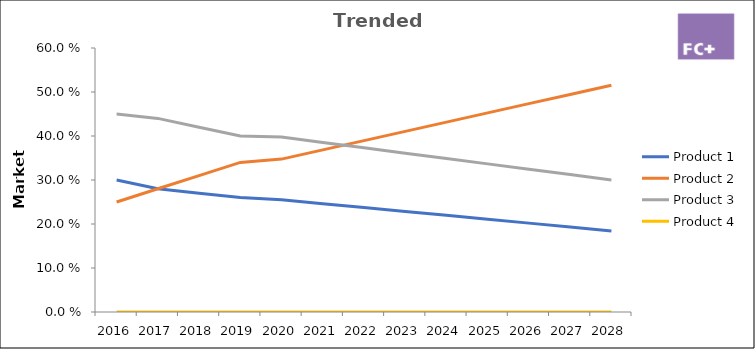
| Category | Product 1 | Product 2 | Product 3 | Product 4 |
|---|---|---|---|---|
| 2016.0 | 0.3 | 0.25 | 0.45 | 0 |
| 2017.0 | 0.28 | 0.28 | 0.44 | 0 |
| 2018.0 | 0.27 | 0.31 | 0.42 | 0 |
| 2019.0 | 0.26 | 0.34 | 0.4 | 0 |
| 2020.0 | 0.255 | 0.348 | 0.398 | 0 |
| 2021.0 | 0.246 | 0.368 | 0.385 | 0 |
| 2022.0 | 0.237 | 0.39 | 0.373 | 0 |
| 2023.0 | 0.228 | 0.41 | 0.361 | 0 |
| 2024.0 | 0.22 | 0.431 | 0.349 | 0 |
| 2025.0 | 0.211 | 0.452 | 0.337 | 0 |
| 2026.0 | 0.202 | 0.473 | 0.324 | 0 |
| 2027.0 | 0.193 | 0.494 | 0.312 | 0 |
| 2028.0 | 0.184 | 0.515 | 0.3 | 0 |